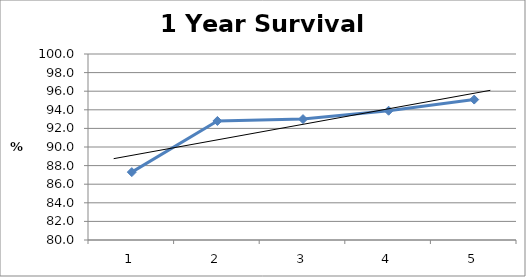
| Category | 1-year      per cent |
|---|---|
| 0 | 87.3 |
| 1 | 92.8 |
| 2 | 93 |
| 3 | 93.9 |
| 4 | 95.1 |